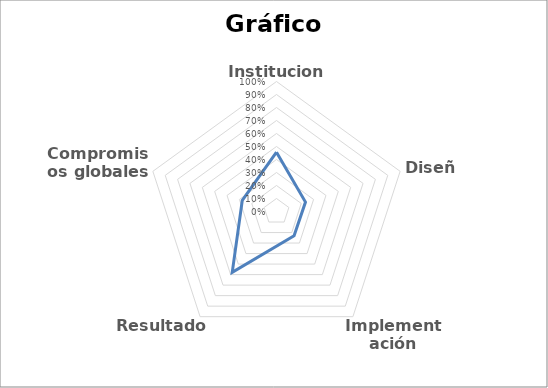
| Category | Series 0 |
|---|---|
| Institucional | 0.457 |
| Diseño | 0.234 |
| Implementación | 0.23 |
| Resultados | 0.579 |
| Compromisos globales | 0.277 |